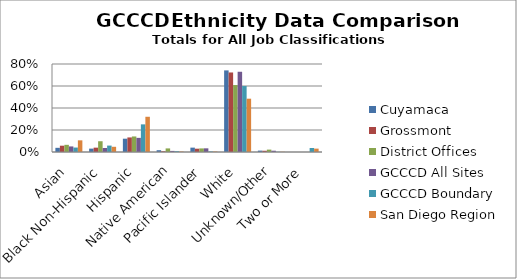
| Category | Cuyamaca | Grossmont | District Offices | GCCCD All Sites | GCCCD Boundary | San Diego Region |
|---|---|---|---|---|---|---|
| Asian | 0.038 | 0.057 | 0.065 | 0.051 | 0.04 | 0.106 |
| Black Non-Hispanic | 0.031 | 0.039 | 0.098 | 0.036 | 0.058 | 0.047 |
| Hispanic | 0.121 | 0.132 | 0.141 | 0.128 | 0.251 | 0.32 |
| Native American | 0.016 | 0.007 | 0.033 | 0.01 | 0.007 | 0.005 |
| Pacific Islander | 0.04 | 0.03 | 0.033 | 0.033 | 0.005 | 0.004 |
| White | 0.742 | 0.723 | 0.609 | 0.729 | 0.6 | 0.485 |
| Unknown/Other | 0.013 | 0.011 | 0.022 | 0.012 | 0.002 | 0.002 |
| Two or More | 0 | 0 | 0 | 0 | 0.036 | 0.031 |